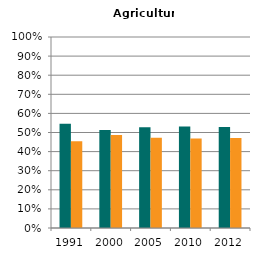
| Category | Male | Female |
|---|---|---|
| 1991.0 | 0.545 | 0.455 |
| 2000.0 | 0.513 | 0.487 |
| 2005.0 | 0.528 | 0.472 |
| 2010.0 | 0.531 | 0.469 |
| 2012.0 | 0.529 | 0.471 |